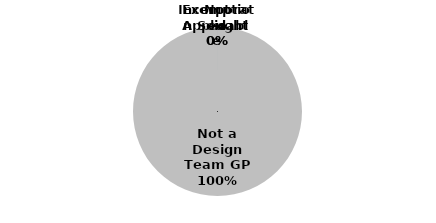
| Category | Series 0 |
|---|---|
| Not a Design Team GP | 10 |
| Not Applicable | 0 |
| Incorporated | 0 |
| Exemption Sought | 0 |